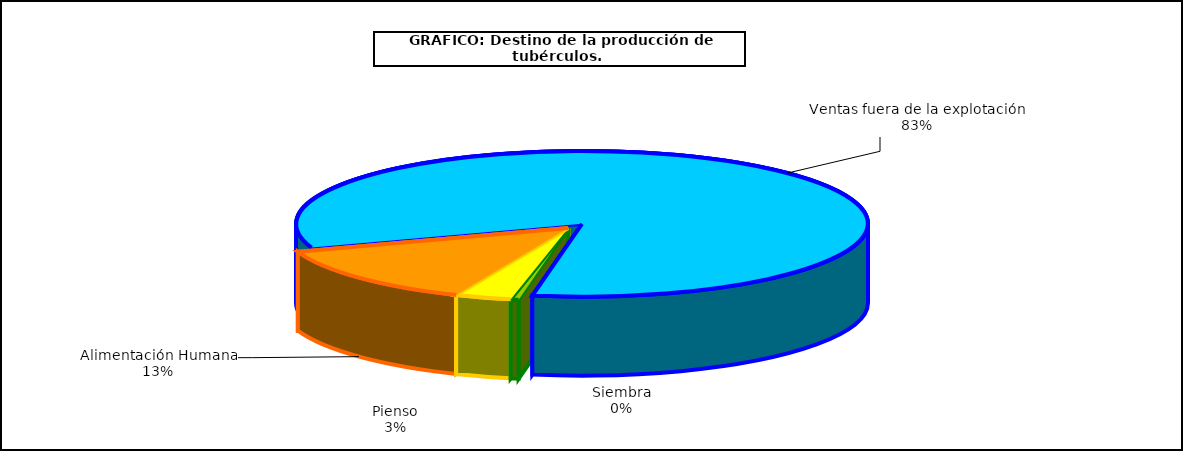
| Category | Series 0 |
|---|---|
| 0 | 10337 |
| 1 | 74022 |
| 2 | 309289 |
| 3 | 1929882 |